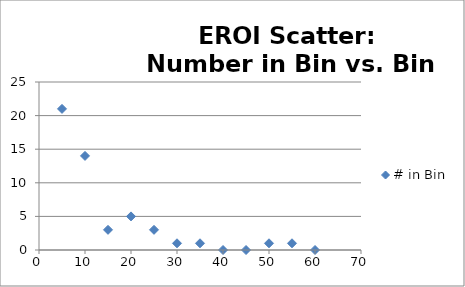
| Category | # in Bin |
|---|---|
| 5.0 | 21 |
| 10.0 | 14 |
| 15.0 | 3 |
| 20.0 | 5 |
| 25.0 | 3 |
| 30.0 | 1 |
| 35.0 | 1 |
| 40.0 | 0 |
| 45.0 | 0 |
| 50.0 | 1 |
| 55.0 | 1 |
| 60.0 | 0 |